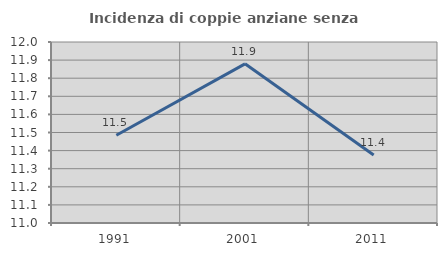
| Category | Incidenza di coppie anziane senza figli  |
|---|---|
| 1991.0 | 11.485 |
| 2001.0 | 11.879 |
| 2011.0 | 11.375 |